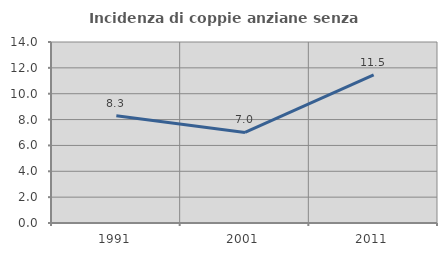
| Category | Incidenza di coppie anziane senza figli  |
|---|---|
| 1991.0 | 8.299 |
| 2001.0 | 7.004 |
| 2011.0 | 11.462 |